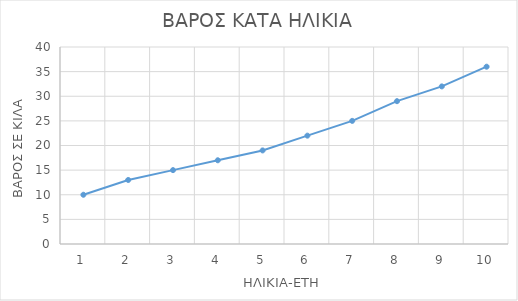
| Category | ΒΑΡΟΣ |
|---|---|
| 0 | 10 |
| 1 | 13 |
| 2 | 15 |
| 3 | 17 |
| 4 | 19 |
| 5 | 22 |
| 6 | 25 |
| 7 | 29 |
| 8 | 32 |
| 9 | 36 |